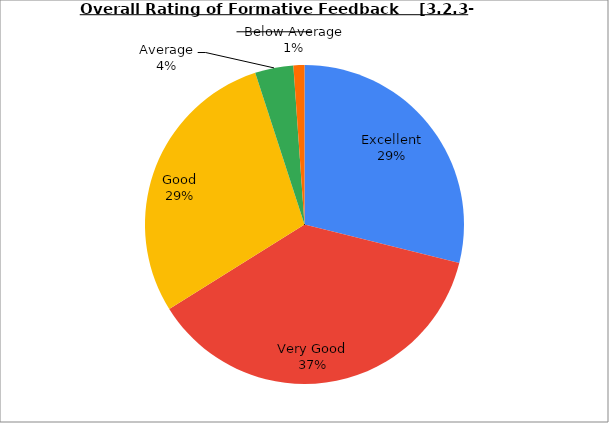
| Category | Series 0 |
|---|---|
| Excellent | 28.889 |
| Very Good | 37.222 |
| Good | 28.889 |
| Average | 3.889 |
| Below Average | 1.111 |